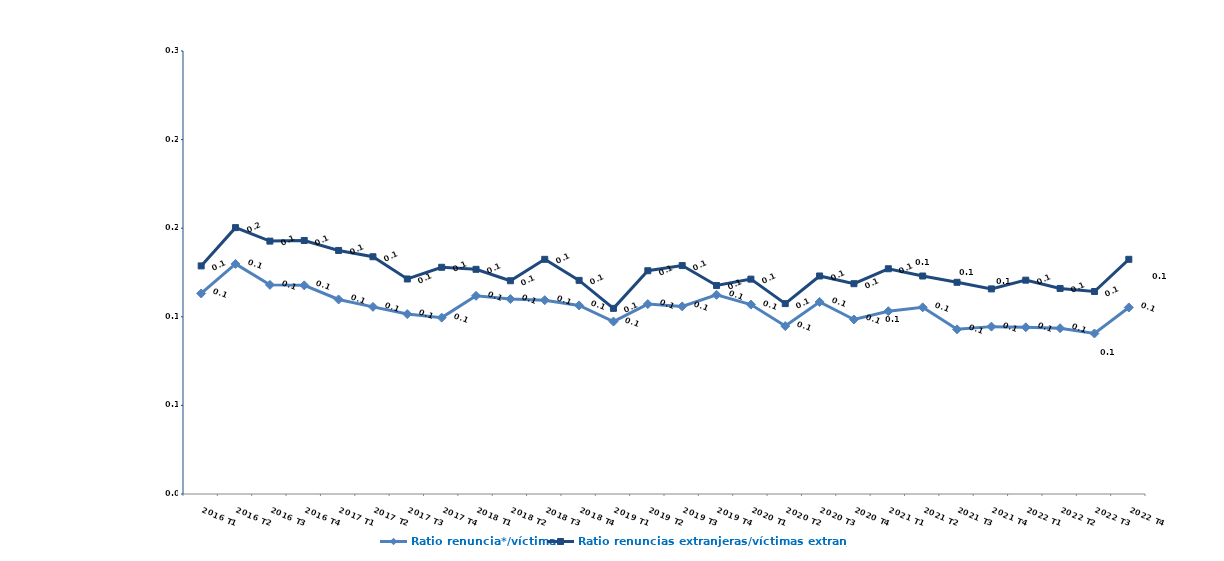
| Category | Ratio renuncia*/víctima | Ratio renuncias extranjeras/víctimas extranjeras |
|---|---|---|
| 2016 T1 | 0.113 | 0.129 |
| 2016 T2 | 0.13 | 0.15 |
| 2016 T3 | 0.118 | 0.143 |
| 2016 T4 | 0.118 | 0.143 |
| 2017 T1 | 0.11 | 0.137 |
| 2017 T2 | 0.106 | 0.134 |
| 2017 T3 | 0.102 | 0.121 |
| 2017 T4 | 0.1 | 0.128 |
| 2018 T1 | 0.112 | 0.127 |
| 2018 T2 | 0.11 | 0.12 |
| 2018 T3 | 0.109 | 0.132 |
| 2018 T4 | 0.106 | 0.121 |
| 2019 T1 | 0.097 | 0.105 |
| 2019 T2 | 0.107 | 0.126 |
| 2019 T3 | 0.106 | 0.129 |
| 2019 T4 | 0.112 | 0.118 |
| 2020 T1 | 0.107 | 0.121 |
| 2020 T2 | 0.095 | 0.107 |
| 2020 T3 | 0.108 | 0.123 |
| 2020 T4 | 0.098 | 0.119 |
| 2021 T1 | 0.103 | 0.127 |
| 2021 T2 | 0.105 | 0.123 |
| 2021 T3 | 0.093 | 0.119 |
| 2021 T4 | 0.094 | 0.116 |
| 2022 T1 | 0.094 | 0.121 |
| 2022 T2 | 0.094 | 0.116 |
| 2022 T3 | 0.091 | 0.114 |
| 2022 T4 | 0.105 | 0.132 |